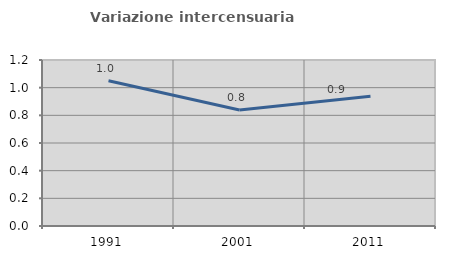
| Category | Variazione intercensuaria annua |
|---|---|
| 1991.0 | 1.05 |
| 2001.0 | 0.839 |
| 2011.0 | 0.937 |